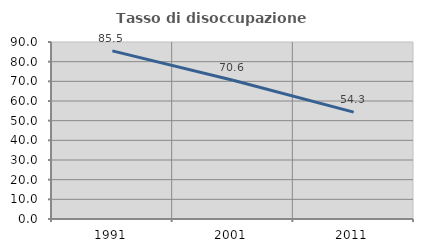
| Category | Tasso di disoccupazione giovanile  |
|---|---|
| 1991.0 | 85.507 |
| 2001.0 | 70.588 |
| 2011.0 | 54.348 |